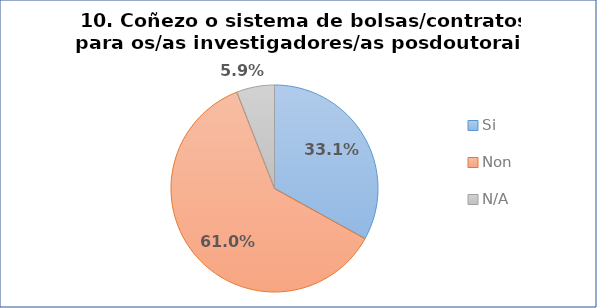
| Category | Pregunta 10. Coñezo o sistema de bolsas/contratos para os/as investigadores/as posdoutorais |
|---|---|
| Si | 0.331 |
| Non | 0.61 |
| N/A | 0.059 |